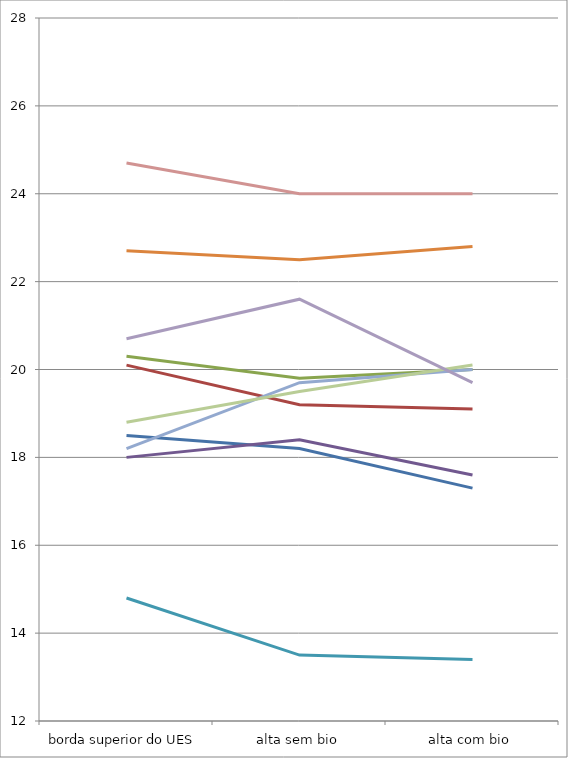
| Category | Series 0 | Series 1 | Series 2 | Series 3 | Series 4 | Series 5 | Series 6 | Series 7 | Series 8 | Series 9 |
|---|---|---|---|---|---|---|---|---|---|---|
| borda superior do UES | 18.5 | 20.1 | 20.3 | 18 | 14.8 | 22.7 | 18.2 | 24.7 | 18.8 | 20.7 |
| alta sem bio | 18.2 | 19.2 | 19.8 | 18.4 | 13.5 | 22.5 | 19.7 | 24 | 19.5 | 21.6 |
| alta com bio | 17.3 | 19.1 | 20 | 17.6 | 13.4 | 22.8 | 20 | 24 | 20.1 | 19.7 |